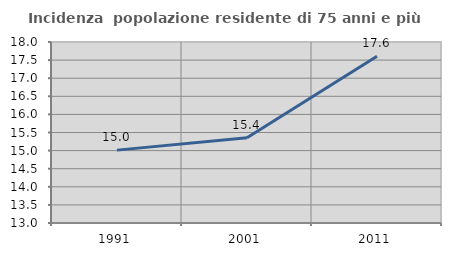
| Category | Incidenza  popolazione residente di 75 anni e più |
|---|---|
| 1991.0 | 15.013 |
| 2001.0 | 15.356 |
| 2011.0 | 17.607 |